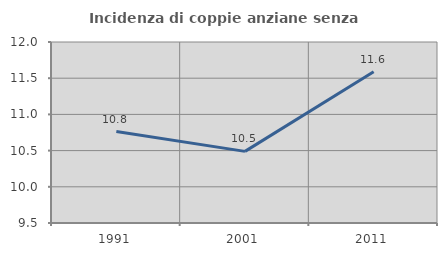
| Category | Incidenza di coppie anziane senza figli  |
|---|---|
| 1991.0 | 10.762 |
| 2001.0 | 10.49 |
| 2011.0 | 11.588 |